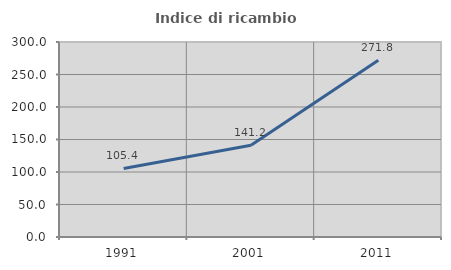
| Category | Indice di ricambio occupazionale  |
|---|---|
| 1991.0 | 105.445 |
| 2001.0 | 141.237 |
| 2011.0 | 271.788 |